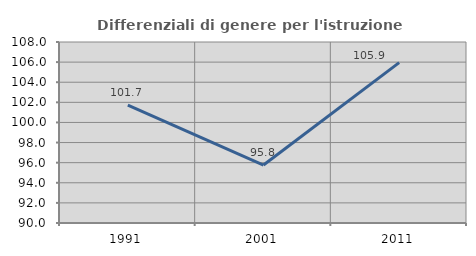
| Category | Differenziali di genere per l'istruzione superiore |
|---|---|
| 1991.0 | 101.717 |
| 2001.0 | 95.762 |
| 2011.0 | 105.946 |